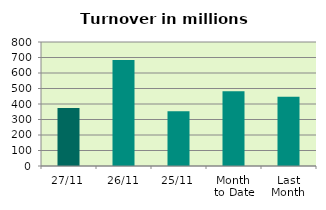
| Category | Series 0 |
|---|---|
| 27/11 | 374.305 |
| 26/11 | 683.624 |
| 25/11 | 352.503 |
| Month 
to Date | 483.029 |
| Last
Month | 446.481 |